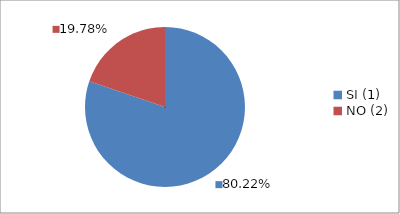
| Category | Series 0 |
|---|---|
| SI (1) | 0.802 |
| NO (2) | 0.198 |